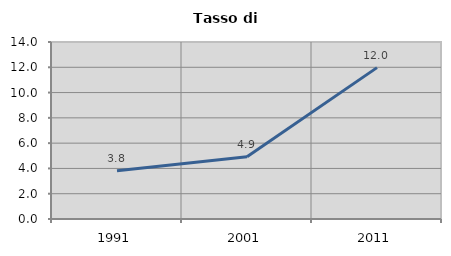
| Category | Tasso di disoccupazione   |
|---|---|
| 1991.0 | 3.82 |
| 2001.0 | 4.918 |
| 2011.0 | 11.973 |